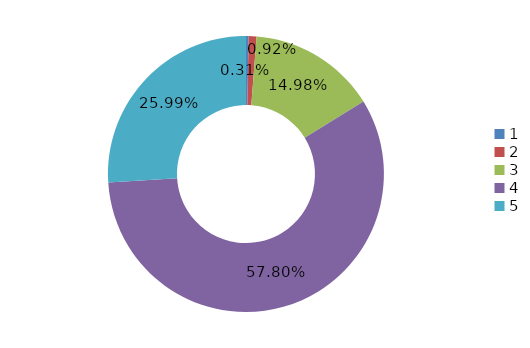
| Category | Series 1 |
|---|---|
| 0 | 0.003 |
| 1 | 0.009 |
| 2 | 0.15 |
| 3 | 0.578 |
| 4 | 0.26 |